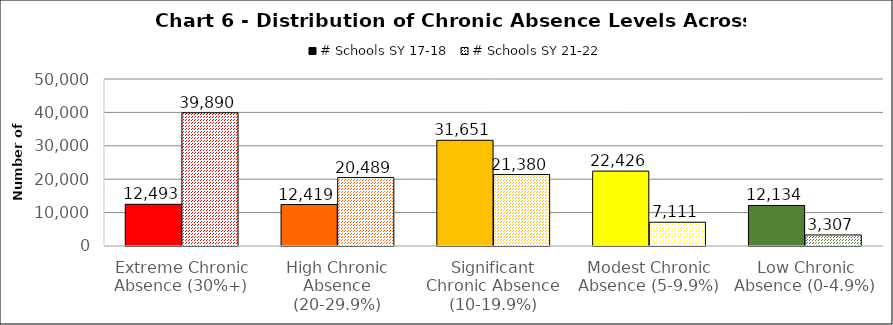
| Category | # Schools SY 17-18 | # Schools SY 21-22 |
|---|---|---|
| Extreme Chronic Absence (30%+) | 12493 | 39890 |
| High Chronic Absence (20-29.9%) | 12419 | 20489 |
| Significant Chronic Absence (10-19.9%) | 31651 | 21380 |
| Modest Chronic Absence (5-9.9%) | 22426 | 7111 |
| Low Chronic Absence (0-4.9%) | 12134 | 3307 |